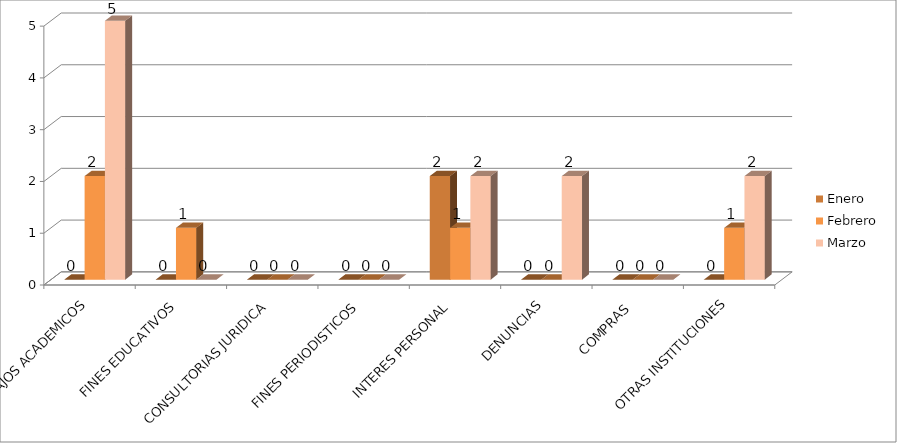
| Category | Enero | Febrero | Marzo |
|---|---|---|---|
| TRABAJOS ACADEMICOS | 0 | 2 | 5 |
| FINES EDUCATIVOS | 0 | 1 | 0 |
| CONSULTORIAS JURIDICA | 0 | 0 | 0 |
| FINES PERIODISTICOS | 0 | 0 | 0 |
| INTERES PERSONAL | 2 | 1 | 2 |
| DENUNCIAS | 0 | 0 | 2 |
| COMPRAS  | 0 | 0 | 0 |
| OTRAS INSTITUCIONES | 0 | 1 | 2 |